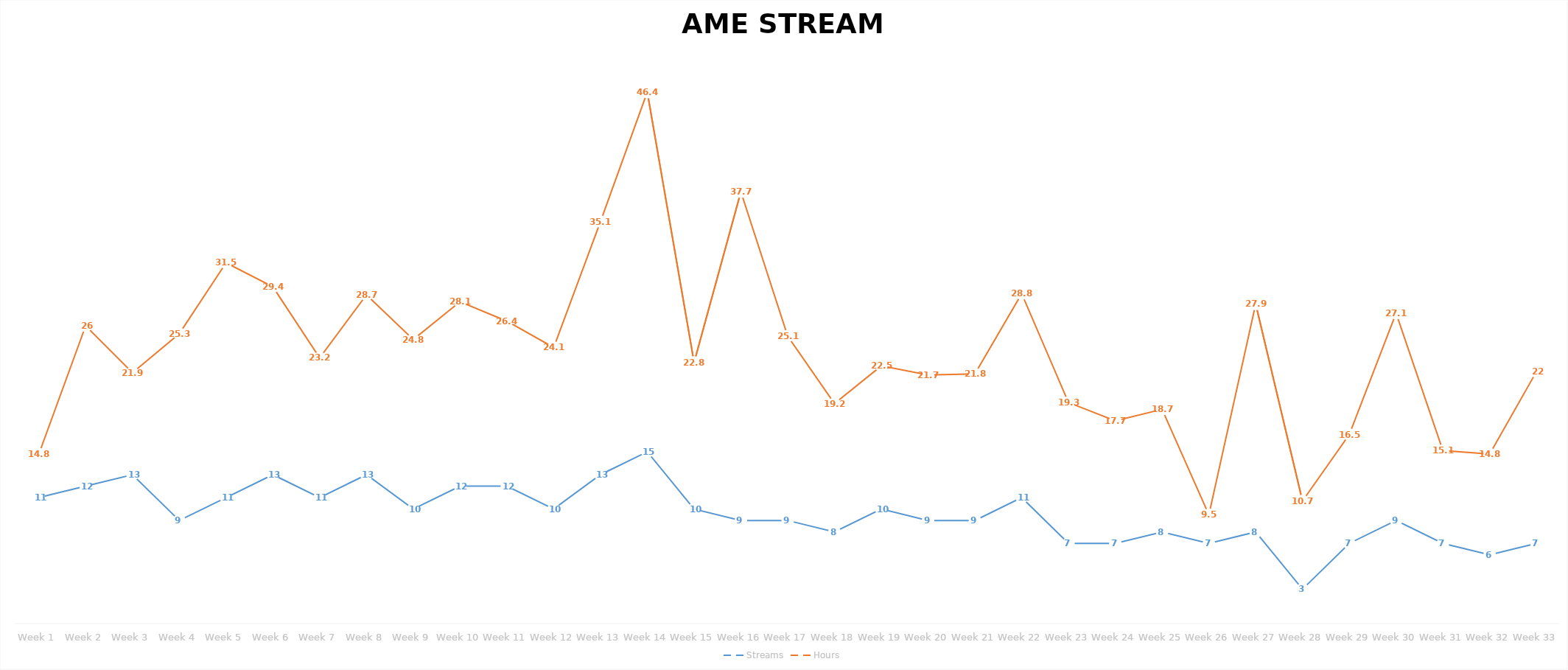
| Category | Streams | Hours |
|---|---|---|
| Week 1 | 11 | 14.8 |
| Week 2 | 12 | 26 |
| Week 3 | 13 | 21.9 |
| Week 4 | 9 | 25.3 |
| Week 5 | 11 | 31.5 |
| Week 6 | 13 | 29.4 |
| Week 7 | 11 | 23.2 |
| Week 8 | 13 | 28.7 |
| Week 9 | 10 | 24.8 |
| Week 10 | 12 | 28.1 |
| Week 11 | 12 | 26.4 |
| Week 12 | 10 | 24.1 |
| Week 13 | 13 | 35.1 |
| Week 14 | 15 | 46.4 |
| Week 15 | 10 | 22.8 |
| Week 16 | 9 | 37.7 |
| Week 17 | 9 | 25.1 |
| Week 18 | 8 | 19.2 |
| Week 19 | 10 | 22.5 |
| Week 20 | 9 | 21.7 |
| Week 21 | 9 | 21.8 |
| Week 22 | 11 | 28.8 |
| Week 23 | 7 | 19.3 |
| Week 24 | 7 | 17.7 |
| Week 25 | 8 | 18.7 |
| Week 26 | 7 | 9.5 |
| Week 27 | 8 | 27.9 |
| Week 28 | 3 | 10.7 |
| Week 29 | 7 | 16.5 |
| Week 30 | 9 | 27.1 |
| Week 31 | 7 | 15.1 |
| Week 32 | 6 | 14.8 |
| Week 33 | 7 | 22 |